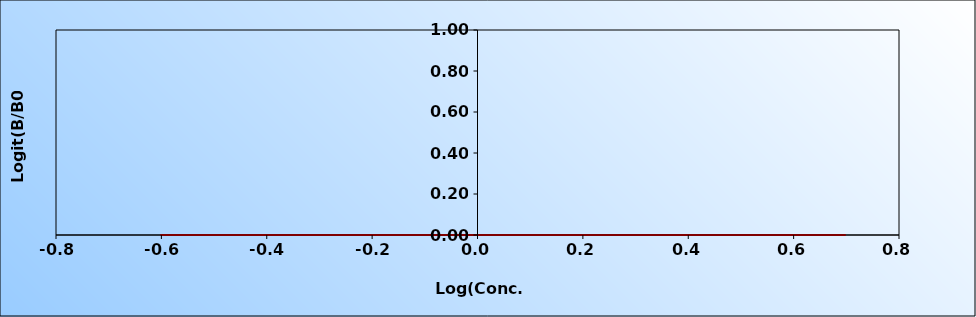
| Category | Series 0 |
|---|---|
| -0.6020599913279624 | 0 |
| 0.0 | 0 |
| 0.3979400086720376 | 0 |
| 0.6989700043360189 | 0 |